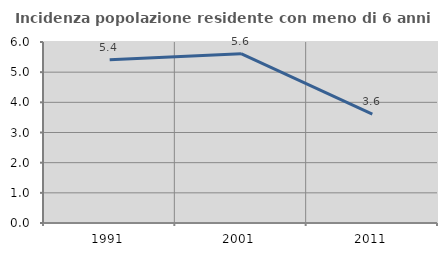
| Category | Incidenza popolazione residente con meno di 6 anni |
|---|---|
| 1991.0 | 5.409 |
| 2001.0 | 5.614 |
| 2011.0 | 3.613 |